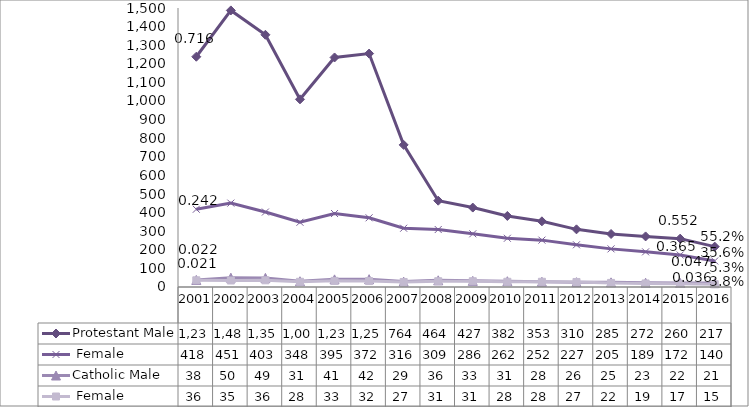
| Category | Protestant | Catholic |
|---|---|---|
| 2001.0 | 418 | 36 |
| 2002.0 | 451 | 35 |
| 2003.0 | 403 | 36 |
| 2004.0 | 348 | 28 |
| 2005.0 | 395 | 33 |
| 2006.0 | 372 | 32 |
| 2007.0 | 316 | 27 |
| 2008.0 | 309 | 31 |
| 2009.0 | 286 | 31 |
| 2010.0 | 262 | 28 |
| 2011.0 | 252 | 28 |
| 2012.0 | 227 | 27 |
| 2013.0 | 205 | 22 |
| 2014.0 | 189 | 19 |
| 2015.0 | 172 | 17 |
| 2016.0 | 140 | 15 |